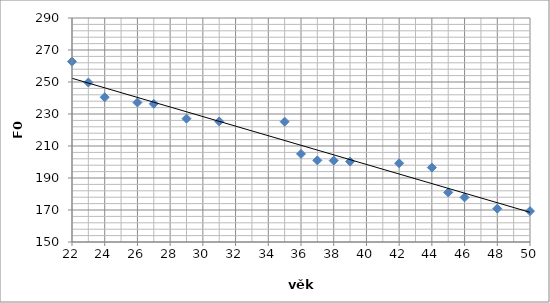
| Category | F0 |
|---|---|
| 22.0 | 262.74 |
| 23.0 | 249.68 |
| 24.0 | 240.45 |
| 26.0 | 237.18 |
| 27.0 | 236.37 |
| 29.0 | 227.06 |
| 31.0 | 225.35 |
| 35.0 | 225.2 |
| 36.0 | 205.06 |
| 37.0 | 201.01 |
| 38.0 | 200.86 |
| 39.0 | 200.27 |
| 42.0 | 199.22 |
| 44.0 | 196.54 |
| 45.0 | 180.96 |
| 46.0 | 177.91 |
| 48.0 | 170.83 |
| 50.0 | 169.29 |